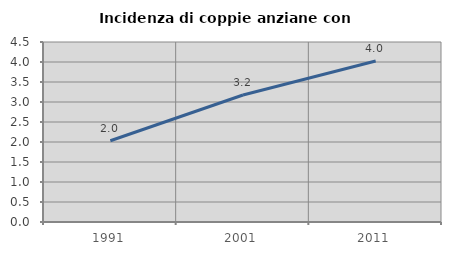
| Category | Incidenza di coppie anziane con figli |
|---|---|
| 1991.0 | 2.03 |
| 2001.0 | 3.175 |
| 2011.0 | 4.025 |